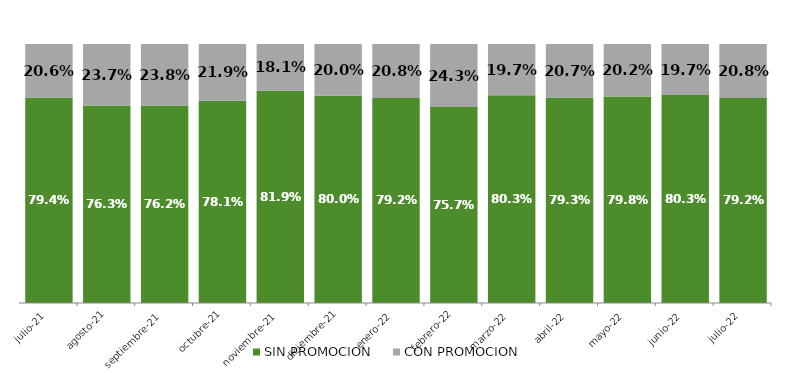
| Category | SIN PROMOCION   | CON PROMOCION   |
|---|---|---|
| 2021-07-01 | 0.794 | 0.206 |
| 2021-08-01 | 0.763 | 0.237 |
| 2021-09-01 | 0.762 | 0.238 |
| 2021-10-01 | 0.781 | 0.219 |
| 2021-11-01 | 0.819 | 0.181 |
| 2021-12-01 | 0.8 | 0.2 |
| 2022-01-01 | 0.792 | 0.208 |
| 2022-02-01 | 0.757 | 0.243 |
| 2022-03-01 | 0.803 | 0.197 |
| 2022-04-01 | 0.793 | 0.207 |
| 2022-05-01 | 0.798 | 0.202 |
| 2022-06-01 | 0.803 | 0.197 |
| 2022-07-01 | 0.792 | 0.208 |